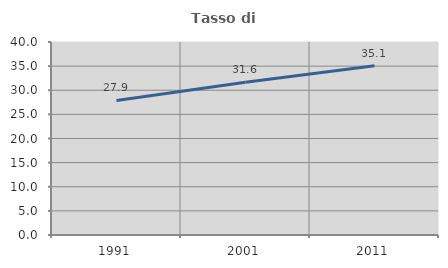
| Category | Tasso di occupazione   |
|---|---|
| 1991.0 | 27.886 |
| 2001.0 | 31.638 |
| 2011.0 | 35.069 |